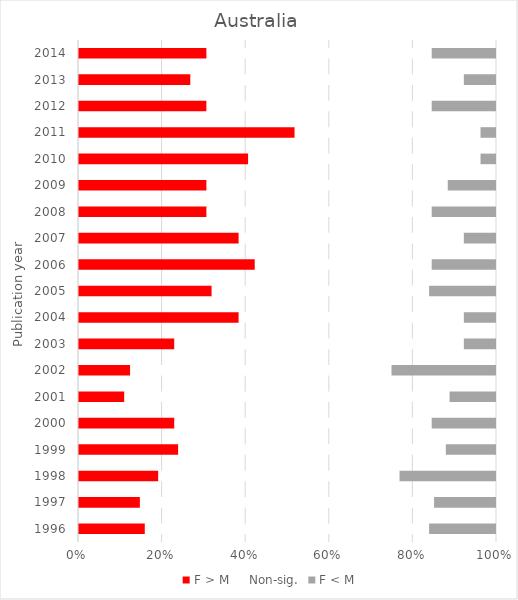
| Category | F > M | Non-sig. | F < M |
|---|---|---|---|
| 1996.0 | 4 | 17 | 4 |
| 1997.0 | 4 | 19 | 4 |
| 1998.0 | 5 | 15 | 6 |
| 1999.0 | 6 | 16 | 3 |
| 2000.0 | 6 | 16 | 4 |
| 2001.0 | 3 | 21 | 3 |
| 2002.0 | 3 | 15 | 6 |
| 2003.0 | 6 | 18 | 2 |
| 2004.0 | 10 | 14 | 2 |
| 2005.0 | 8 | 13 | 4 |
| 2006.0 | 11 | 11 | 4 |
| 2007.0 | 10 | 14 | 2 |
| 2008.0 | 8 | 14 | 4 |
| 2009.0 | 8 | 15 | 3 |
| 2010.0 | 11 | 15 | 1 |
| 2011.0 | 14 | 12 | 1 |
| 2012.0 | 8 | 14 | 4 |
| 2013.0 | 7 | 17 | 2 |
| 2014.0 | 8 | 14 | 4 |